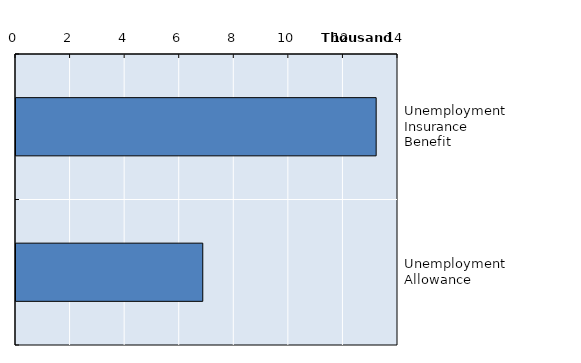
| Category | Series 0 |
|---|---|
| Unemployment Insurance Benefit | 13200 |
| Unemployment Allowance | 6845.333 |